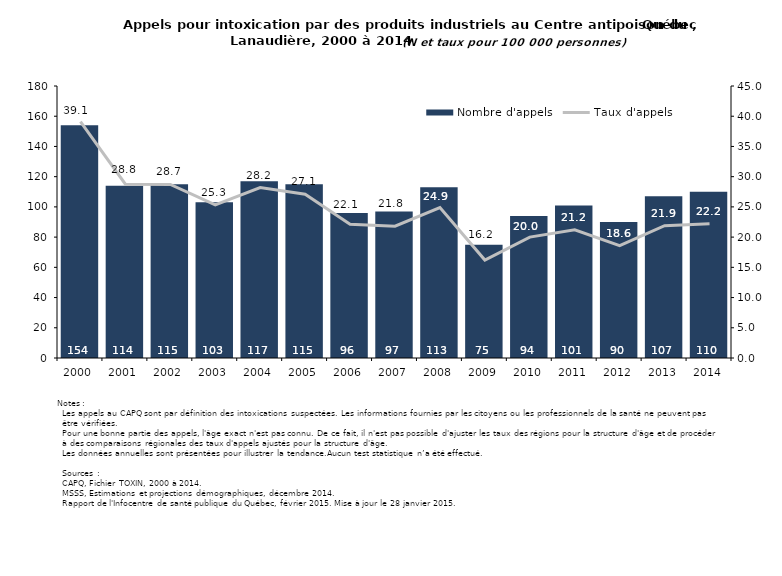
| Category | Nombre d'appels |
|---|---|
| 2000.0 | 154 |
| 2001.0 | 114 |
| 2002.0 | 115 |
| 2003.0 | 103 |
| 2004.0 | 117 |
| 2005.0 | 115 |
| 2006.0 | 96 |
| 2007.0 | 97 |
| 2008.0 | 113 |
| 2009.0 | 75 |
| 2010.0 | 94 |
| 2011.0 | 101 |
| 2012.0 | 90 |
| 2013.0 | 107 |
| 2014.0 | 110 |